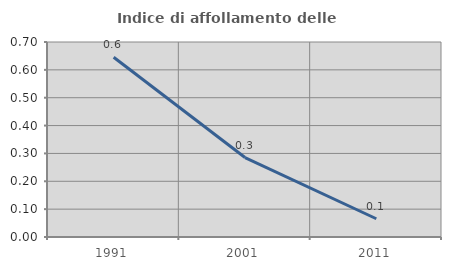
| Category | Indice di affollamento delle abitazioni  |
|---|---|
| 1991.0 | 0.645 |
| 2001.0 | 0.285 |
| 2011.0 | 0.066 |